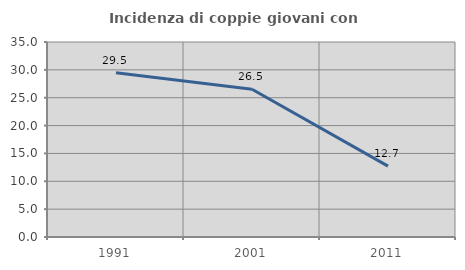
| Category | Incidenza di coppie giovani con figli |
|---|---|
| 1991.0 | 29.471 |
| 2001.0 | 26.523 |
| 2011.0 | 12.716 |